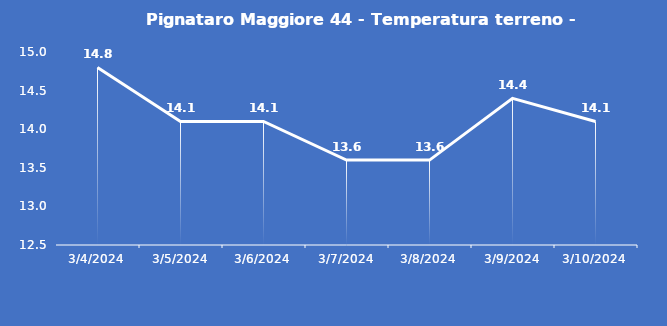
| Category | Pignataro Maggiore 44 - Temperatura terreno - Grezzo (°C) |
|---|---|
| 3/4/24 | 14.8 |
| 3/5/24 | 14.1 |
| 3/6/24 | 14.1 |
| 3/7/24 | 13.6 |
| 3/8/24 | 13.6 |
| 3/9/24 | 14.4 |
| 3/10/24 | 14.1 |